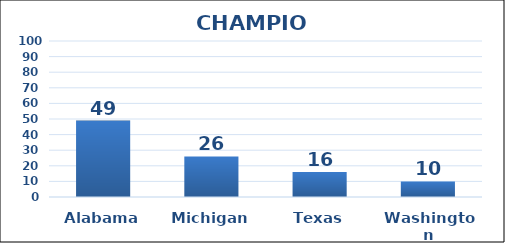
| Category | Series 0 |
|---|---|
| Alabama | 49 |
| Michigan | 26 |
| Texas | 16 |
| Washington | 10 |